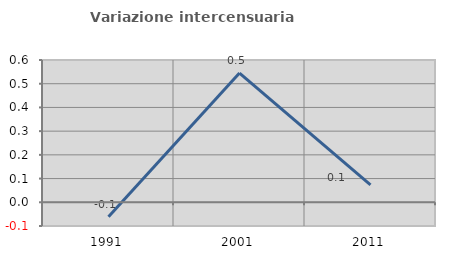
| Category | Variazione intercensuaria annua |
|---|---|
| 1991.0 | -0.061 |
| 2001.0 | 0.545 |
| 2011.0 | 0.073 |